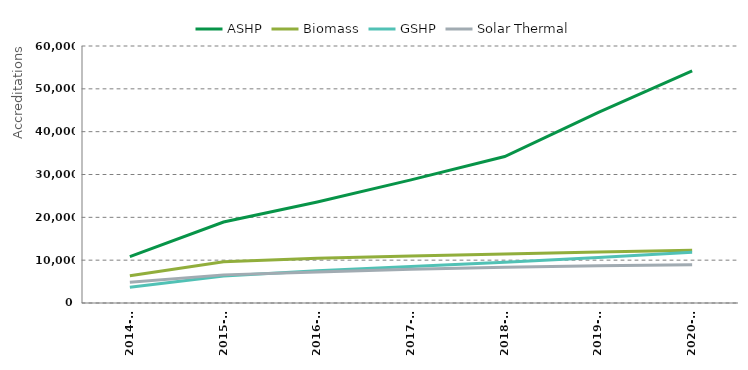
| Category | ASHP | Biomass | GSHP | Solar Thermal |
|---|---|---|---|---|
| 2014-15 | 10811 | 6380 | 3655 | 4844 |
| 2015-16 | 18905 | 9646 | 6314 | 6566 |
| 2016-17 | 23569 | 10475 | 7512 | 7245 |
| 2017-18 | 28737 | 10980 | 8531 | 7888 |
| 2018-19 | 34199 | 11431 | 9486 | 8336 |
| 2019-20 | 44507 | 11928 | 10646 | 8670 |
| 2020-21 | 54217 | 12339 | 11837 | 8944 |